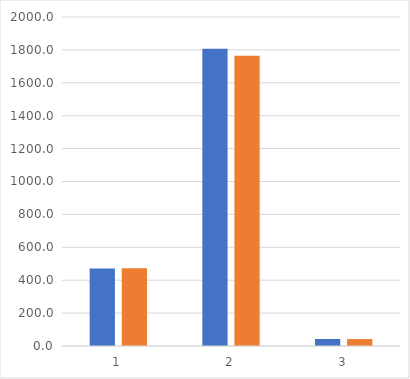
| Category | empirical charachteristics | theoretical charachteristics |
|---|---|---|
| 0 | 471.867 | 472 |
| 1 | 1806.427 | 1764 |
| 2 | 42.502 | 42 |